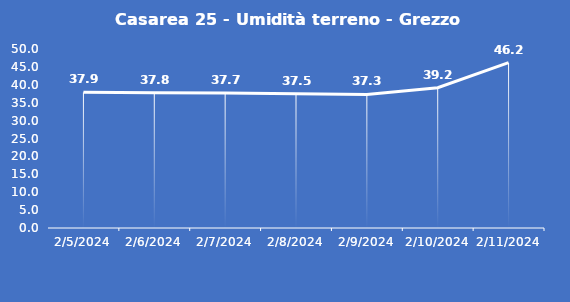
| Category | Casarea 25 - Umidità terreno - Grezzo (%VWC) |
|---|---|
| 2/5/24 | 37.9 |
| 2/6/24 | 37.8 |
| 2/7/24 | 37.7 |
| 2/8/24 | 37.5 |
| 2/9/24 | 37.3 |
| 2/10/24 | 39.2 |
| 2/11/24 | 46.2 |